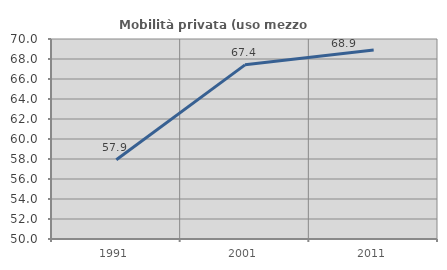
| Category | Mobilità privata (uso mezzo privato) |
|---|---|
| 1991.0 | 57.932 |
| 2001.0 | 67.415 |
| 2011.0 | 68.9 |